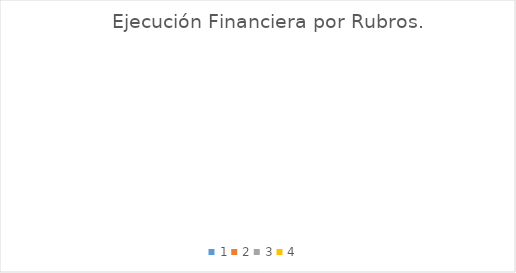
| Category | Series 0 | Series 1 |
|---|---|---|
| 0 | 200 | 360025226 |
| 1 | 300 | 3773200 |
| 2 | 500 | 31500000 |
| 3 | 800 | 906064500 |